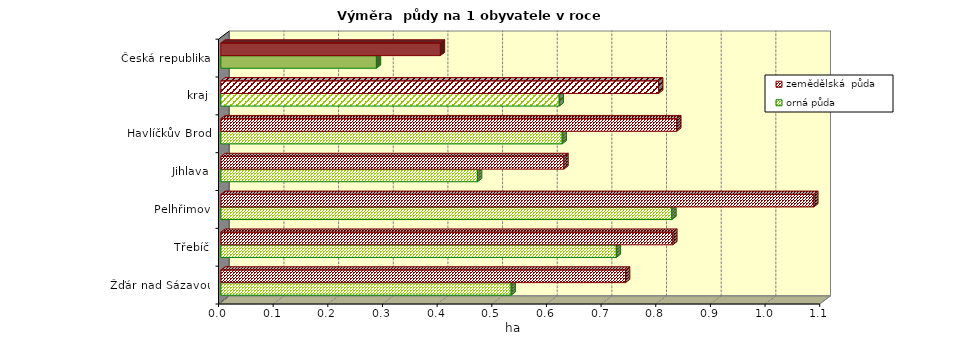
| Category | orná půda | zemědělská  půda |
|---|---|---|
| Žďár nad Sázavou | 0.531 | 0.74 |
| Třebíč | 0.724 | 0.827 |
| Pelhřimov | 0.825 | 1.085 |
| Jihlava | 0.47 | 0.628 |
| Havlíčkův Brod | 0.625 | 0.834 |
| kraj | 0.619 | 0.801 |
| Česká republika | 0.285 | 0.402 |